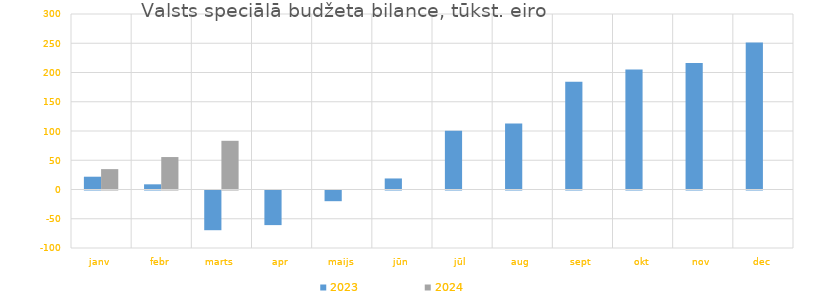
| Category | 2023 | 2024 |
|---|---|---|
| janv | 21850.373 | 34837.439 |
| febr | 8860.895 | 55473.418 |
| marts | -67878.961 | 83250.759 |
| apr | -59148.923 | 0 |
| maijs | -18273.46 | 0 |
| jūn | 18868.968 | 0 |
| jūl | 100483.566 | 0 |
| aug | 112828.993 | 0 |
| sept | 184000.505 | 0 |
| okt | 205121.199 | 0 |
| nov | 216425.067 | 0 |
| dec | 251412.782 | 0 |